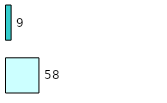
| Category | Series 0 | Series 1 |
|---|---|---|
| 0 | 58 | 9 |